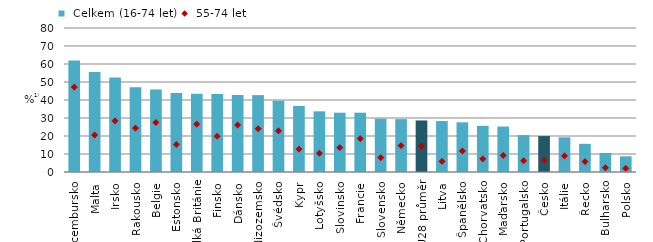
| Category |  Celkem (16-74 let) |
|---|---|
| Lucembursko | 61.918 |
| Malta | 55.543 |
| Irsko | 52.527 |
| Rakousko | 47.036 |
| Belgie | 45.861 |
| Estonsko | 43.845 |
| Velká Británie | 43.498 |
| Finsko | 43.331 |
| Dánsko | 42.789 |
| Nizozemsko | 42.719 |
| Švédsko | 39.518 |
| Kypr | 36.713 |
| Lotyšsko | 33.709 |
| Slovinsko | 32.953 |
| Francie | 32.94 |
| Slovensko | 29.633 |
| Německo | 29.38 |
| EU28 průměr | 28.64 |
| Litva | 28.308 |
| Španělsko | 27.609 |
| Chorvatsko | 25.648 |
| Maďarsko | 25.263 |
| Portugalsko | 20.483 |
| Česko | 19.974 |
| Itálie | 19.269 |
| Řecko | 15.661 |
| Bulharsko | 10.573 |
| Polsko | 8.704 |